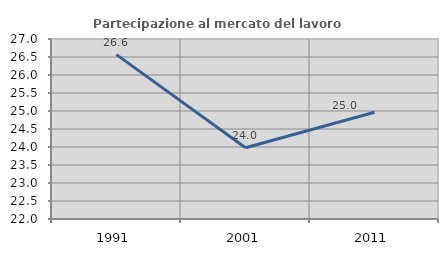
| Category | Partecipazione al mercato del lavoro  femminile |
|---|---|
| 1991.0 | 26.566 |
| 2001.0 | 23.98 |
| 2011.0 | 24.965 |